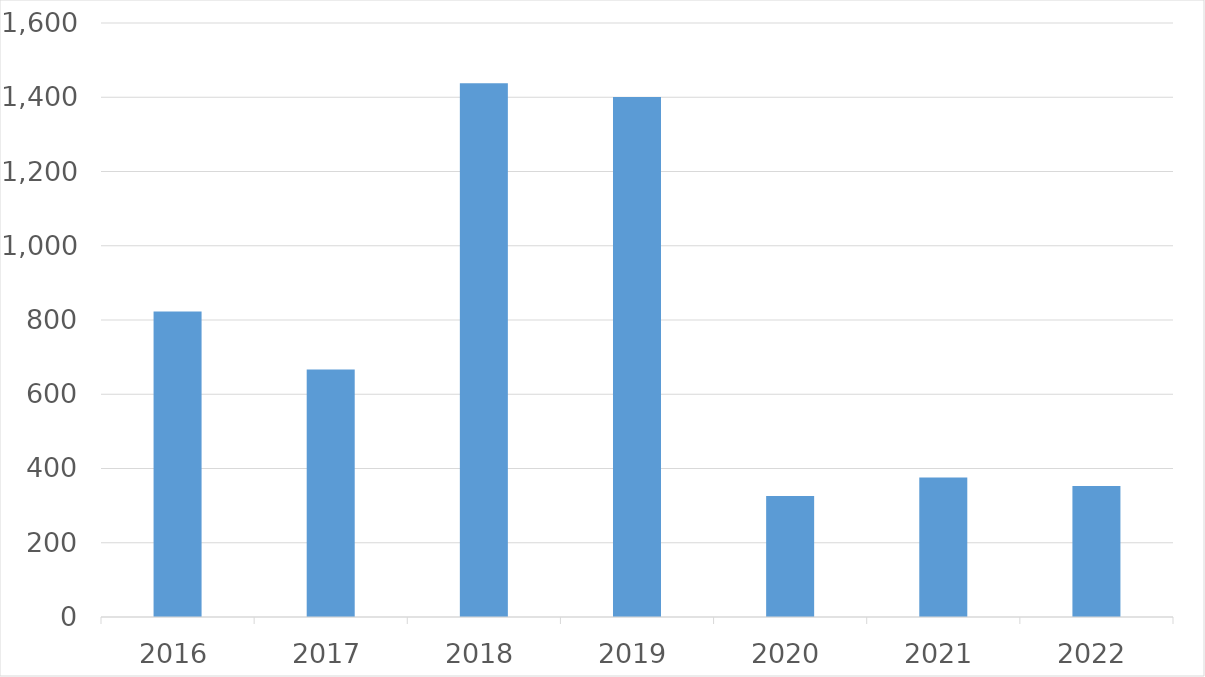
| Category | Series 0 |
|---|---|
| 2016 | 823 |
| 2017 | 667 |
| 2018 | 1438 |
| 2019 | 1401 |
| 2020 | 326 |
| 2021 | 376 |
| 2022 | 353 |